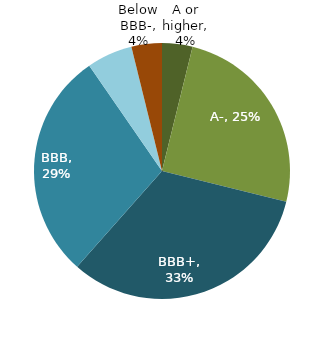
| Category | Series 0 |
|---|---|
| A or higher | 0.038 |
| A- | 0.25 |
| BBB+ | 0.327 |
| BBB | 0.288 |
| BBB- | 0.058 |
| Below BBB- | 0.038 |